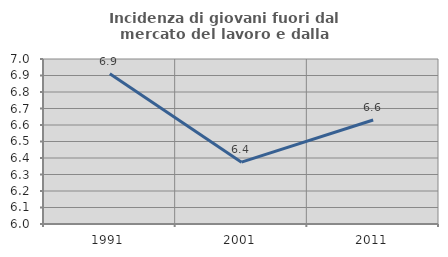
| Category | Incidenza di giovani fuori dal mercato del lavoro e dalla formazione  |
|---|---|
| 1991.0 | 6.911 |
| 2001.0 | 6.375 |
| 2011.0 | 6.63 |